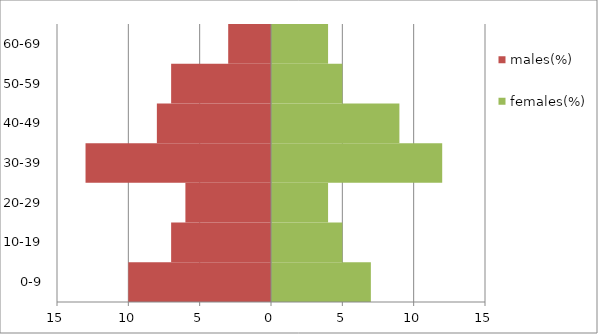
| Category | males(%) | females(%) |
|---|---|---|
| 0-9 | -10 | 7 |
| 10-19 | -7 | 5 |
| 20-29 | -6 | 4 |
| 30-39 | -13 | 12 |
| 40-49 | -8 | 9 |
| 50-59 | -7 | 5 |
| 60-69 | -3 | 4 |